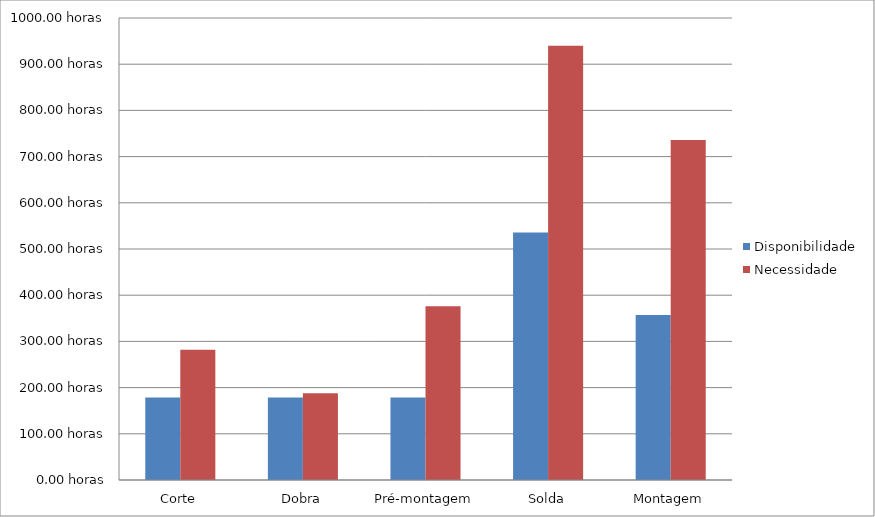
| Category | Disponibilidade | Necessidade |
|---|---|---|
| Corte | 178.5 | 282 |
| Dobra | 178.5 | 188 |
| Pré-montagem | 178.5 | 376 |
| Solda | 535.5 | 940 |
| Montagem | 357 | 736 |